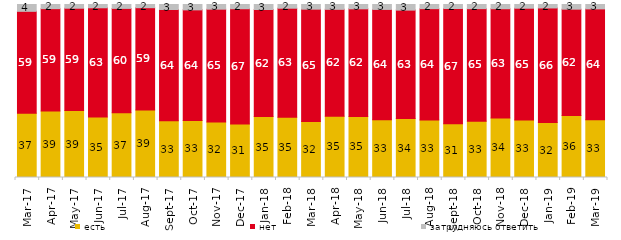
| Category | есть | нет | затрудняюсь ответить |
|---|---|---|---|
| 2017-03-01 | 37.2 | 58.85 | 3.95 |
| 2017-04-01 | 38.5 | 59.1 | 2.4 |
| 2017-05-01 | 38.7 | 59.15 | 2.15 |
| 2017-06-01 | 34.95 | 63.15 | 1.9 |
| 2017-07-01 | 37.4 | 60.35 | 2.25 |
| 2017-08-01 | 39 | 59.15 | 1.85 |
| 2017-09-01 | 32.8 | 64.3 | 2.9 |
| 2017-10-01 | 33 | 63.9 | 3.1 |
| 2017-11-01 | 32.1 | 65.15 | 2.7 |
| 2017-12-01 | 30.95 | 66.6 | 2.45 |
| 2018-01-01 | 35.2 | 61.9 | 2.9 |
| 2018-02-01 | 34.8 | 63.05 | 2.15 |
| 2018-03-01 | 32.35 | 64.95 | 2.7 |
| 2018-04-01 | 35.45 | 61.75 | 2.8 |
| 2018-05-01 | 35.3 | 62.15 | 2.5 |
| 2018-06-01 | 33.45 | 63.7 | 2.85 |
| 2018-07-01 | 34.05 | 62.7 | 3.25 |
| 2018-08-01 | 33.3 | 64.3 | 2.4 |
| 2018-09-01 | 31 | 66.7 | 2.3 |
| 2018-10-01 | 32.55 | 65.05 | 2.4 |
| 2018-11-01 | 34.431 | 63.124 | 2.445 |
| 2018-12-01 | 33.25 | 64.6 | 2.15 |
| 2019-01-01 | 31.75 | 66.25 | 2 |
| 2019-02-01 | 35.8 | 61.5 | 2.7 |
| 2019-03-01 | 33.317 | 64.147 | 2.536 |